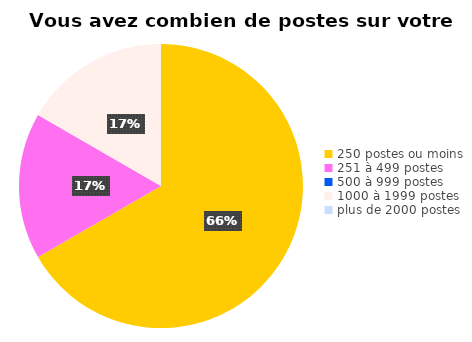
| Category | Series 0 |
|---|---|
| 250 postes ou moins | 4 |
| 251 à 499 postes | 1 |
| 500 à 999 postes | 0 |
| 1000 à 1999 postes | 1 |
| plus de 2000 postes | 0 |